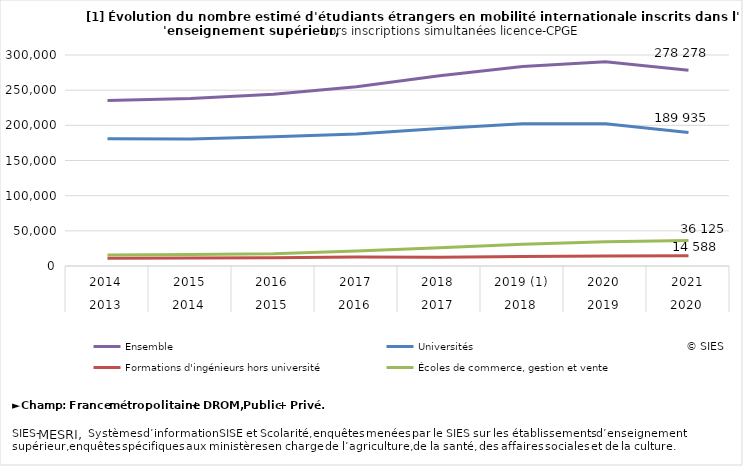
| Category | Ensemble | Universités | Formations d'ingénieurs hors université  | Écoles de commerce, gestion et vente |
|---|---|---|---|---|
| 0 | 235149 | 181040 | 11080 | 15661 |
| 1 | 238179 | 180506 | 11207 | 16423 |
| 2 | 244078 | 183869 | 11592 | 17476 |
| 3 | 254738 | 187642 | 12634 | 21276 |
| 4 | 270463 | 195600 | 12371 | 25860 |
| 5 | 283714 | 202151 | 13379 | 30907 |
| 6 | 290470 | 202140 | 14226 | 34653 |
| 7 | 278278 | 189935 | 14588 | 36125 |